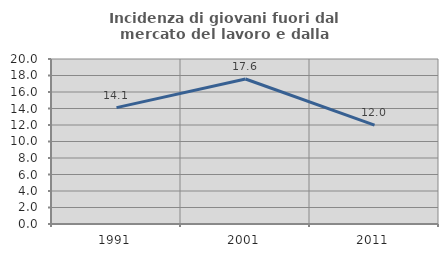
| Category | Incidenza di giovani fuori dal mercato del lavoro e dalla formazione  |
|---|---|
| 1991.0 | 14.107 |
| 2001.0 | 17.572 |
| 2011.0 | 11.978 |